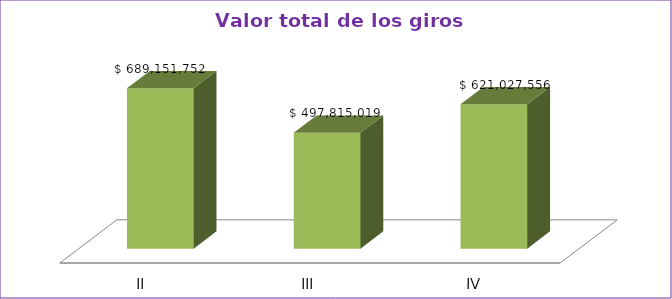
| Category | Series 0 |
|---|---|
| II | 689151752 |
| III | 497815019 |
| IV | 621027556 |